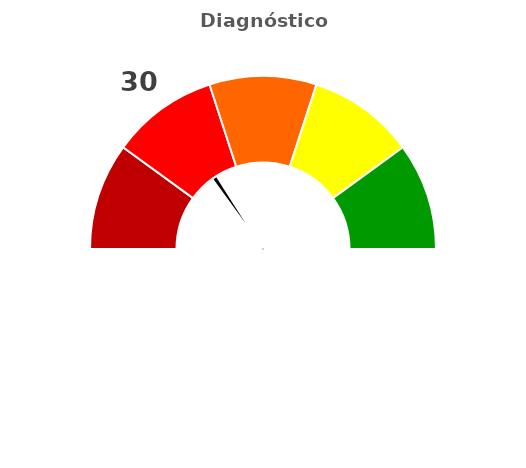
| Category | refe |
|---|---|
| 0 | 30 |
| 1 | 2 |
| 2 | 168 |